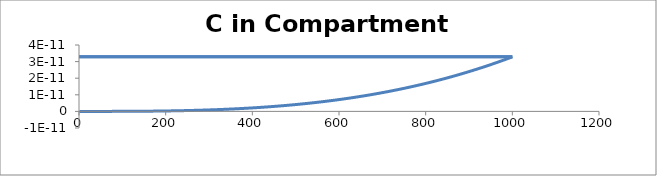
| Category | C - Sys 4 |
|---|---|
| 1.0 | 0 |
| 2.0 | 0 |
| 3.0 | 0 |
| 4.0 | 0 |
| 5.0 | 0 |
| 6.0 | 0 |
| 7.0 | 0 |
| 8.0 | 0 |
| 9.000000000000002 | 0 |
| 10.0 | 0 |
| 11.0 | 0 |
| 12.0 | 0 |
| 13.000000000000002 | 0 |
| 14.0 | 0 |
| 15.0 | 0 |
| 16.0 | 0 |
| 17.0 | 0 |
| 18.000000000000004 | 0 |
| 19.0 | 0 |
| 20.0 | 0 |
| 21.0 | 0 |
| 22.0 | 0 |
| 23.0 | 0 |
| 24.0 | 0 |
| 25.0 | 0 |
| 26.000000000000004 | 0 |
| 27.0 | 0 |
| 28.0 | 0 |
| 29.0 | 0 |
| 30.0 | 0 |
| 31.0 | 0 |
| 32.0 | 0 |
| 33.0 | 0 |
| 34.0 | 0 |
| 35.0 | 0 |
| 36.00000000000001 | 0 |
| 37.0 | 0 |
| 38.0 | 0 |
| 39.0 | 0 |
| 40.0 | 0 |
| 41.0 | 0 |
| 42.0 | 0 |
| 43.0 | 0 |
| 44.0 | 0 |
| 45.0 | 0 |
| 46.0 | 0 |
| 47.0 | 0 |
| 48.0 | 0 |
| 49.0 | 0 |
| 50.0 | 0 |
| 51.00000000000001 | 0 |
| 52.00000000000001 | 0 |
| 53.0 | 0 |
| 54.0 | 0 |
| 55.0 | 0 |
| 56.0 | 0 |
| 57.0 | 0 |
| 58.0 | 0 |
| 59.00000000000001 | 0 |
| 60.0 | 0 |
| 61.0 | 0 |
| 62.0 | 0 |
| 63.0 | 0 |
| 64.0 | 0 |
| 65.0 | 0 |
| 66.0 | 0 |
| 67.0 | 0 |
| 68.0 | 0 |
| 69.0 | 0 |
| 70.0 | 0 |
| 71.00000000000001 | 0 |
| 72.00000000000001 | 0 |
| 73.0 | 0 |
| 74.0 | 0 |
| 75.0 | 0 |
| 76.0 | 0 |
| 77.0 | 0 |
| 78.0 | 0 |
| 79.0 | 0 |
| 80.0 | 0 |
| 81.0 | 0 |
| 82.0 | 0 |
| 83.0 | 0 |
| 84.0 | 0 |
| 85.0 | 0 |
| 86.0 | 0 |
| 87.00000000000001 | 0 |
| 88.0 | 0 |
| 89.0 | 0 |
| 90.0 | 0 |
| 91.0 | 0 |
| 92.0 | 0 |
| 93.0 | 0 |
| 94.0 | 0 |
| 95.0 | 0 |
| 96.0 | 0 |
| 97.0 | 0 |
| 98.0 | 0 |
| 99.0 | 0 |
| 100.0 | 0 |
| 101.0 | 0 |
| 102.00000000000001 | 0 |
| 103.00000000000001 | 0 |
| 104.00000000000001 | 0 |
| 105.0 | 0 |
| 106.0 | 0 |
| 107.0 | 0 |
| 108.0 | 0 |
| 109.0 | 0 |
| 110.0 | 0 |
| 111.0 | 0 |
| 112.0 | 0 |
| 113.0 | 0 |
| 114.0 | 0 |
| 115.0 | 0 |
| 116.0 | 0 |
| 117.0 | 0 |
| 118.00000000000001 | 0 |
| 119.00000000000001 | 0 |
| 120.0 | 0 |
| 121.0 | 0 |
| 122.0 | 0 |
| 123.0 | 0 |
| 124.0 | 0 |
| 125.0 | 0 |
| 126.0 | 0 |
| 127.0 | 0 |
| 128.0 | 0 |
| 129.0 | 0 |
| 130.0 | 0 |
| 131.0 | 0 |
| 132.0 | 0 |
| 133.0 | 0 |
| 134.0 | 0 |
| 135.0 | 0 |
| 136.0 | 0 |
| 137.0 | 0 |
| 138.0 | 0 |
| 139.0 | 0 |
| 140.0 | 0 |
| 141.0 | 0 |
| 142.00000000000003 | 0 |
| 143.00000000000003 | 0 |
| 144.00000000000003 | 0 |
| 145.0 | 0 |
| 146.0 | 0 |
| 147.0 | 0 |
| 148.0 | 0 |
| 149.0 | 0 |
| 150.0 | 0 |
| 151.0 | 0 |
| 152.0 | 0 |
| 153.0 | 0 |
| 154.0 | 0 |
| 155.0 | 0 |
| 156.0 | 0 |
| 157.0 | 0 |
| 158.0 | 0 |
| 159.0 | 0 |
| 160.0 | 0 |
| 161.0 | 0 |
| 162.0 | 0 |
| 163.0 | 0 |
| 164.0 | 0 |
| 165.0 | 0 |
| 166.0 | 0 |
| 167.0 | 0 |
| 168.0 | 0 |
| 169.0 | 0 |
| 170.0 | 0 |
| 171.0 | 0 |
| 172.0 | 0 |
| 173.00000000000003 | 0 |
| 174.00000000000003 | 0 |
| 175.00000000000003 | 0 |
| 176.0 | 0 |
| 177.0 | 0 |
| 178.0 | 0 |
| 179.0 | 0 |
| 180.0 | 0 |
| 181.0 | 0 |
| 182.0 | 0 |
| 183.0 | 0 |
| 184.0 | 0 |
| 185.0 | 0 |
| 186.0 | 0 |
| 187.0 | 0 |
| 188.0 | 0 |
| 189.0 | 0 |
| 190.0 | 0 |
| 191.0 | 0 |
| 192.0 | 0 |
| 193.0 | 0 |
| 194.0 | 0 |
| 195.0 | 0 |
| 196.0 | 0 |
| 197.0 | 0 |
| 198.0 | 0 |
| 199.0 | 0 |
| 200.0 | 0 |
| 201.0 | 0 |
| 202.0 | 0 |
| 203.0 | 0 |
| 204.00000000000003 | 0 |
| 205.00000000000003 | 0 |
| 206.00000000000003 | 0 |
| 207.00000000000003 | 0 |
| 208.00000000000003 | 0 |
| 209.0 | 0 |
| 210.0 | 0 |
| 211.0 | 0 |
| 212.0 | 0 |
| 213.0 | 0 |
| 214.0 | 0 |
| 215.0 | 0 |
| 216.0 | 0 |
| 217.0 | 0 |
| 218.0 | 0 |
| 219.0 | 0 |
| 220.0 | 0 |
| 221.0 | 0 |
| 222.0 | 0 |
| 223.0 | 0 |
| 224.0 | 0 |
| 225.0 | 0 |
| 226.0 | 0 |
| 227.0 | 0 |
| 228.0 | 0 |
| 229.0 | 0 |
| 230.0 | 0 |
| 231.0 | 0 |
| 232.0 | 0 |
| 233.0 | 0 |
| 234.0 | 0 |
| 235.00000000000003 | 0 |
| 236.00000000000003 | 0 |
| 237.00000000000003 | 0 |
| 238.00000000000003 | 0 |
| 239.00000000000003 | 0 |
| 240.0 | 0 |
| 241.0 | 0 |
| 242.0 | 0 |
| 243.0 | 0 |
| 244.0 | 0 |
| 245.0 | 0 |
| 246.0 | 0 |
| 247.0 | 0 |
| 248.0 | 0 |
| 249.0 | 0 |
| 250.0 | 0 |
| 251.0 | 0 |
| 252.0 | 0 |
| 253.0 | 0 |
| 254.0 | 0 |
| 255.0 | 0 |
| 256.0 | 0 |
| 257.0 | 0 |
| 258.0 | 0 |
| 259.0 | 0 |
| 260.0 | 0 |
| 261.0 | 0 |
| 262.0 | 0 |
| 263.0 | 0 |
| 264.0 | 0 |
| 265.0 | 0 |
| 266.0 | 0 |
| 267.0 | 0 |
| 268.0 | 0 |
| 269.0 | 0 |
| 270.0 | 0 |
| 271.0 | 0 |
| 272.0 | 0 |
| 273.0 | 0 |
| 274.0 | 0 |
| 275.0 | 0 |
| 276.0 | 0 |
| 277.0 | 0 |
| 278.0 | 0 |
| 279.0 | 0 |
| 280.0 | 0 |
| 281.0 | 0 |
| 282.0 | 0 |
| 283.00000000000006 | 0 |
| 284.00000000000006 | 0 |
| 285.00000000000006 | 0 |
| 286.00000000000006 | 0 |
| 287.00000000000006 | 0 |
| 288.00000000000006 | 0 |
| 289.0 | 0 |
| 290.0 | 0 |
| 291.0 | 0 |
| 292.0 | 0 |
| 293.0 | 0 |
| 294.0 | 0 |
| 295.0 | 0 |
| 296.0 | 0 |
| 297.0 | 0 |
| 298.0 | 0 |
| 299.0 | 0 |
| 300.0 | 0 |
| 301.0 | 0 |
| 302.0 | 0 |
| 303.0 | 0 |
| 304.0 | 0 |
| 305.0 | 0 |
| 306.0 | 0 |
| 307.0 | 0 |
| 308.0 | 0 |
| 309.0 | 0 |
| 310.0 | 0 |
| 311.0 | 0 |
| 312.0 | 0 |
| 313.0 | 0 |
| 314.0 | 0 |
| 315.0 | 0 |
| 316.0 | 0 |
| 317.0 | 0 |
| 318.0 | 0 |
| 319.0 | 0 |
| 320.0 | 0 |
| 321.0 | 0 |
| 322.0 | 0 |
| 323.0 | 0 |
| 324.0 | 0 |
| 325.0 | 0 |
| 326.0 | 0 |
| 327.0 | 0 |
| 328.0 | 0 |
| 329.0 | 0 |
| 330.0 | 0 |
| 331.0 | 0 |
| 332.0 | 0 |
| 333.0 | 0 |
| 334.0 | 0 |
| 335.0 | 0 |
| 336.0 | 0 |
| 337.0 | 0 |
| 338.0 | 0 |
| 339.0 | 0 |
| 340.0 | 0 |
| 341.0 | 0 |
| 342.0 | 0 |
| 343.0 | 0 |
| 344.0 | 0 |
| 345.00000000000006 | 0 |
| 346.00000000000006 | 0 |
| 347.00000000000006 | 0 |
| 348.00000000000006 | 0 |
| 349.00000000000006 | 0 |
| 350.00000000000006 | 0 |
| 351.00000000000006 | 0 |
| 352.0 | 0 |
| 353.0 | 0 |
| 354.0 | 0 |
| 355.0 | 0 |
| 356.0 | 0 |
| 357.0 | 0 |
| 358.0 | 0 |
| 359.0 | 0 |
| 360.0 | 0 |
| 361.0 | 0 |
| 362.0 | 0 |
| 363.0 | 0 |
| 364.0 | 0 |
| 365.0 | 0 |
| 366.0 | 0 |
| 367.0 | 0 |
| 368.0 | 0 |
| 369.0 | 0 |
| 370.0 | 0 |
| 371.0 | 0 |
| 372.0 | 0 |
| 373.0 | 0 |
| 374.0 | 0 |
| 375.0 | 0 |
| 376.0 | 0 |
| 377.0 | 0 |
| 378.0 | 0 |
| 379.0 | 0 |
| 380.0 | 0 |
| 381.0 | 0 |
| 382.0 | 0 |
| 383.0 | 0 |
| 384.0 | 0 |
| 385.0 | 0 |
| 386.0 | 0 |
| 387.0 | 0 |
| 388.0 | 0 |
| 389.0 | 0 |
| 390.0 | 0 |
| 391.0 | 0 |
| 392.0 | 0 |
| 393.0 | 0 |
| 394.0 | 0 |
| 395.0 | 0 |
| 396.0 | 0 |
| 397.0 | 0 |
| 398.0 | 0 |
| 399.0 | 0 |
| 400.0 | 0 |
| 401.0 | 0 |
| 402.0 | 0 |
| 403.0 | 0 |
| 404.0 | 0 |
| 405.0 | 0 |
| 406.0 | 0 |
| 407.0 | 0 |
| 408.00000000000006 | 0 |
| 409.00000000000006 | 0 |
| 410.00000000000006 | 0 |
| 411.00000000000006 | 0 |
| 412.00000000000006 | 0 |
| 413.00000000000006 | 0 |
| 414.00000000000006 | 0 |
| 415.00000000000006 | 0 |
| 416.00000000000006 | 0 |
| 417.0 | 0 |
| 418.0 | 0 |
| 419.0 | 0 |
| 420.0 | 0 |
| 421.0 | 0 |
| 422.0 | 0 |
| 423.0 | 0 |
| 424.0 | 0 |
| 425.0 | 0 |
| 426.0 | 0 |
| 427.0 | 0 |
| 428.0 | 0 |
| 429.0 | 0 |
| 430.0 | 0 |
| 431.0 | 0 |
| 432.0 | 0 |
| 433.0 | 0 |
| 434.0 | 0 |
| 435.0 | 0 |
| 436.0 | 0 |
| 437.0 | 0 |
| 438.0 | 0 |
| 439.0 | 0 |
| 440.0 | 0 |
| 441.0 | 0 |
| 442.0 | 0 |
| 443.0 | 0 |
| 444.0 | 0 |
| 445.0 | 0 |
| 446.0 | 0 |
| 447.0 | 0 |
| 448.0 | 0 |
| 449.0 | 0 |
| 450.0 | 0 |
| 451.0 | 0 |
| 452.0 | 0 |
| 453.0 | 0 |
| 454.0 | 0 |
| 455.0 | 0 |
| 456.0 | 0 |
| 457.0 | 0 |
| 458.0 | 0 |
| 459.0 | 0 |
| 460.0 | 0 |
| 461.0 | 0 |
| 462.0 | 0 |
| 463.0 | 0 |
| 464.0 | 0 |
| 465.0 | 0 |
| 466.0 | 0 |
| 467.0 | 0 |
| 468.0 | 0 |
| 469.0 | 0 |
| 470.00000000000006 | 0 |
| 471.00000000000006 | 0 |
| 472.00000000000006 | 0 |
| 473.00000000000006 | 0 |
| 474.00000000000006 | 0 |
| 475.00000000000006 | 0 |
| 476.00000000000006 | 0 |
| 477.00000000000006 | 0 |
| 478.00000000000006 | 0 |
| 479.00000000000006 | 0 |
| 480.0 | 0 |
| 481.0 | 0 |
| 482.0 | 0 |
| 483.0 | 0 |
| 484.0 | 0 |
| 485.0 | 0 |
| 486.0 | 0 |
| 487.0 | 0 |
| 488.0 | 0 |
| 489.0 | 0 |
| 490.0 | 0 |
| 491.0 | 0 |
| 492.0 | 0 |
| 493.0 | 0 |
| 494.0 | 0 |
| 495.0 | 0 |
| 496.0 | 0 |
| 497.0 | 0 |
| 498.0 | 0 |
| 499.0 | 0 |
| 500.0 | 0 |
| 501.0 | 0 |
| 502.0 | 0 |
| 503.0 | 0 |
| 504.0 | 0 |
| 505.0 | 0 |
| 506.0 | 0 |
| 507.0 | 0 |
| 508.0 | 0 |
| 509.0 | 0 |
| 510.0 | 0 |
| 511.0 | 0 |
| 512.0 | 0 |
| 513.0 | 0 |
| 514.0 | 0 |
| 515.0 | 0 |
| 516.0 | 0 |
| 517.0 | 0 |
| 518.0 | 0 |
| 519.0 | 0 |
| 520.0 | 0 |
| 521.0 | 0 |
| 522.0 | 0 |
| 523.0 | 0 |
| 524.0 | 0 |
| 525.0 | 0 |
| 526.0 | 0 |
| 527.0 | 0 |
| 528.0 | 0 |
| 529.0 | 0 |
| 530.0 | 0 |
| 531.0 | 0 |
| 532.0 | 0 |
| 533.0 | 0 |
| 534.0 | 0 |
| 535.0 | 0 |
| 536.0 | 0 |
| 537.0 | 0 |
| 538.0 | 0 |
| 539.0 | 0 |
| 540.0 | 0 |
| 541.0 | 0 |
| 542.0 | 0 |
| 543.0 | 0 |
| 544.0 | 0 |
| 545.0 | 0 |
| 546.0 | 0 |
| 547.0 | 0 |
| 548.0 | 0 |
| 549.0 | 0 |
| 550.0 | 0 |
| 551.0 | 0 |
| 552.0 | 0 |
| 553.0 | 0 |
| 554.0 | 0 |
| 555.0 | 0 |
| 556.0 | 0 |
| 557.0 | 0 |
| 558.0 | 0 |
| 559.0 | 0 |
| 560.0 | 0 |
| 561.0 | 0 |
| 562.0 | 0 |
| 563.0 | 0 |
| 564.0 | 0 |
| 565.0000000000001 | 0 |
| 566.0000000000001 | 0 |
| 567.0000000000001 | 0 |
| 568.0000000000001 | 0 |
| 569.0000000000001 | 0 |
| 570.0000000000001 | 0 |
| 571.0000000000001 | 0 |
| 572.0000000000001 | 0 |
| 573.0000000000001 | 0 |
| 574.0000000000001 | 0 |
| 575.0000000000001 | 0 |
| 576.0000000000001 | 0 |
| 577.0 | 0 |
| 578.0 | 0 |
| 579.0 | 0 |
| 580.0 | 0 |
| 581.0 | 0 |
| 582.0 | 0 |
| 583.0 | 0 |
| 584.0 | 0 |
| 585.0 | 0 |
| 586.0 | 0 |
| 587.0 | 0 |
| 588.0 | 0 |
| 589.0 | 0 |
| 590.0 | 0 |
| 591.0 | 0 |
| 592.0 | 0 |
| 593.0 | 0 |
| 594.0 | 0 |
| 595.0 | 0 |
| 596.0 | 0 |
| 597.0 | 0 |
| 598.0 | 0 |
| 599.0 | 0 |
| 600.0 | 0 |
| 601.0 | 0 |
| 602.0 | 0 |
| 603.0 | 0 |
| 604.0 | 0 |
| 605.0 | 0 |
| 606.0 | 0 |
| 607.0 | 0 |
| 608.0 | 0 |
| 609.0 | 0 |
| 610.0 | 0 |
| 611.0 | 0 |
| 612.0 | 0 |
| 613.0 | 0 |
| 614.0 | 0 |
| 615.0 | 0 |
| 616.0 | 0 |
| 617.0 | 0 |
| 618.0 | 0 |
| 619.0 | 0 |
| 620.0 | 0 |
| 621.0 | 0 |
| 622.0 | 0 |
| 623.0 | 0 |
| 624.0 | 0 |
| 625.0 | 0 |
| 626.0 | 0 |
| 627.0 | 0 |
| 628.0 | 0 |
| 629.0 | 0 |
| 630.0 | 0 |
| 631.0 | 0 |
| 632.0 | 0 |
| 633.0 | 0 |
| 634.0 | 0 |
| 635.0 | 0 |
| 636.0 | 0 |
| 637.0 | 0 |
| 638.0 | 0 |
| 639.0 | 0 |
| 640.0 | 0 |
| 641.0 | 0 |
| 642.0 | 0 |
| 643.0 | 0 |
| 644.0 | 0 |
| 645.0 | 0 |
| 646.0 | 0 |
| 647.0 | 0 |
| 648.0 | 0 |
| 649.0 | 0 |
| 650.0 | 0 |
| 651.0 | 0 |
| 652.0 | 0 |
| 653.0 | 0 |
| 654.0 | 0 |
| 655.0 | 0 |
| 656.0 | 0 |
| 657.0 | 0 |
| 658.0 | 0 |
| 659.0 | 0 |
| 660.0 | 0 |
| 661.0 | 0 |
| 662.0 | 0 |
| 663.0 | 0 |
| 664.0 | 0 |
| 665.0 | 0 |
| 666.0 | 0 |
| 667.0 | 0 |
| 668.0 | 0 |
| 669.0 | 0 |
| 670.0 | 0 |
| 671.0 | 0 |
| 672.0 | 0 |
| 673.0 | 0 |
| 674.0 | 0 |
| 675.0 | 0 |
| 676.0 | 0 |
| 677.0 | 0 |
| 678.0 | 0 |
| 679.0 | 0 |
| 680.0 | 0 |
| 681.0 | 0 |
| 682.0 | 0 |
| 683.0 | 0 |
| 684.0 | 0 |
| 685.0 | 0 |
| 686.0 | 0 |
| 687.0 | 0 |
| 688.0 | 0 |
| 689.0 | 0 |
| 690.0000000000001 | 0 |
| 691.0000000000001 | 0 |
| 692.0000000000001 | 0 |
| 693.0000000000001 | 0 |
| 694.0000000000001 | 0 |
| 695.0000000000001 | 0 |
| 696.0000000000001 | 0 |
| 697.0000000000001 | 0 |
| 698.0000000000001 | 0 |
| 699.0000000000001 | 0 |
| 700.0000000000001 | 0 |
| 701.0000000000001 | 0 |
| 702.0000000000001 | 0 |
| 703.0000000000001 | 0 |
| 704.0 | 0 |
| 705.0 | 0 |
| 706.0 | 0 |
| 707.0 | 0 |
| 708.0 | 0 |
| 709.0 | 0 |
| 710.0 | 0 |
| 711.0 | 0 |
| 712.0 | 0 |
| 713.0 | 0 |
| 714.0 | 0 |
| 715.0 | 0 |
| 716.0 | 0 |
| 717.0 | 0 |
| 718.0 | 0 |
| 719.0 | 0 |
| 720.0 | 0 |
| 721.0 | 0 |
| 722.0 | 0 |
| 723.0 | 0 |
| 724.0 | 0 |
| 725.0 | 0 |
| 726.0 | 0 |
| 727.0 | 0 |
| 728.0 | 0 |
| 729.0 | 0 |
| 730.0 | 0 |
| 731.0 | 0 |
| 732.0 | 0 |
| 733.0 | 0 |
| 734.0 | 0 |
| 735.0 | 0 |
| 736.0 | 0 |
| 737.0 | 0 |
| 738.0 | 0 |
| 739.0 | 0 |
| 740.0 | 0 |
| 741.0 | 0 |
| 742.0 | 0 |
| 743.0 | 0 |
| 744.0 | 0 |
| 745.0 | 0 |
| 746.0 | 0 |
| 747.0 | 0 |
| 748.0 | 0 |
| 749.0 | 0 |
| 750.0 | 0 |
| 751.0 | 0 |
| 752.0 | 0 |
| 753.0 | 0 |
| 754.0 | 0 |
| 755.0 | 0 |
| 756.0 | 0 |
| 757.0 | 0 |
| 758.0 | 0 |
| 759.0 | 0 |
| 760.0 | 0 |
| 761.0 | 0 |
| 762.0 | 0 |
| 763.0 | 0 |
| 764.0 | 0 |
| 765.0 | 0 |
| 766.0 | 0 |
| 767.0 | 0 |
| 768.0 | 0 |
| 769.0 | 0 |
| 770.0 | 0 |
| 771.0 | 0 |
| 772.0 | 0 |
| 773.0 | 0 |
| 774.0 | 0 |
| 775.0 | 0 |
| 776.0 | 0 |
| 777.0 | 0 |
| 778.0 | 0 |
| 779.0 | 0 |
| 780.0 | 0 |
| 781.0 | 0 |
| 782.0 | 0 |
| 783.0 | 0 |
| 784.0 | 0 |
| 785.0 | 0 |
| 786.0 | 0 |
| 787.0 | 0 |
| 788.0 | 0 |
| 789.0 | 0 |
| 790.0 | 0 |
| 791.0 | 0 |
| 792.0 | 0 |
| 793.0 | 0 |
| 794.0 | 0 |
| 795.0 | 0 |
| 796.0 | 0 |
| 797.0 | 0 |
| 798.0 | 0 |
| 799.0 | 0 |
| 800.0 | 0 |
| 801.0 | 0 |
| 802.0 | 0 |
| 803.0 | 0 |
| 804.0 | 0 |
| 805.0 | 0 |
| 806.0 | 0 |
| 807.0 | 0 |
| 808.0 | 0 |
| 809.0 | 0 |
| 810.0 | 0 |
| 811.0 | 0 |
| 812.0 | 0 |
| 813.0 | 0 |
| 814.0 | 0 |
| 815.0000000000001 | 0 |
| 816.0000000000001 | 0 |
| 817.0000000000001 | 0 |
| 818.0000000000001 | 0 |
| 819.0000000000001 | 0 |
| 820.0000000000001 | 0 |
| 821.0000000000001 | 0 |
| 822.0000000000001 | 0 |
| 823.0000000000001 | 0 |
| 824.0000000000001 | 0 |
| 825.0000000000001 | 0 |
| 826.0000000000001 | 0 |
| 827.0000000000001 | 0 |
| 828.0000000000001 | 0 |
| 829.0000000000001 | 0 |
| 830.0000000000001 | 0 |
| 831.0000000000001 | 0 |
| 832.0000000000001 | 0 |
| 833.0 | 0 |
| 834.0 | 0 |
| 835.0 | 0 |
| 836.0 | 0 |
| 837.0 | 0 |
| 838.0 | 0 |
| 839.0 | 0 |
| 840.0 | 0 |
| 841.0 | 0 |
| 842.0 | 0 |
| 843.0 | 0 |
| 844.0 | 0 |
| 845.0 | 0 |
| 846.0 | 0 |
| 847.0 | 0 |
| 848.0 | 0 |
| 849.0 | 0 |
| 850.0 | 0 |
| 851.0 | 0 |
| 852.0 | 0 |
| 853.0 | 0 |
| 854.0 | 0 |
| 855.0 | 0 |
| 856.0 | 0 |
| 857.0 | 0 |
| 858.0 | 0 |
| 859.0 | 0 |
| 860.0 | 0 |
| 861.0 | 0 |
| 862.0 | 0 |
| 863.0 | 0 |
| 864.0 | 0 |
| 865.0 | 0 |
| 866.0 | 0 |
| 867.0 | 0 |
| 868.0 | 0 |
| 869.0 | 0 |
| 870.0 | 0 |
| 871.0 | 0 |
| 872.0 | 0 |
| 873.0 | 0 |
| 874.0 | 0 |
| 875.0 | 0 |
| 876.0 | 0 |
| 877.0 | 0 |
| 878.0 | 0 |
| 879.0 | 0 |
| 880.0 | 0 |
| 881.0 | 0 |
| 882.0 | 0 |
| 883.0 | 0 |
| 884.0 | 0 |
| 885.0 | 0 |
| 886.0 | 0 |
| 887.0 | 0 |
| 888.0 | 0 |
| 889.0 | 0 |
| 890.0 | 0 |
| 891.0 | 0 |
| 892.0 | 0 |
| 893.0 | 0 |
| 894.0 | 0 |
| 895.0 | 0 |
| 896.0 | 0 |
| 897.0 | 0 |
| 898.0 | 0 |
| 899.0 | 0 |
| 900.0 | 0 |
| 901.0 | 0 |
| 902.0 | 0 |
| 903.0 | 0 |
| 904.0 | 0 |
| 905.0 | 0 |
| 906.0 | 0 |
| 907.0 | 0 |
| 908.0 | 0 |
| 909.0 | 0 |
| 910.0 | 0 |
| 911.0 | 0 |
| 912.0 | 0 |
| 913.0 | 0 |
| 914.0 | 0 |
| 915.0 | 0 |
| 916.0 | 0 |
| 917.0 | 0 |
| 918.0 | 0 |
| 919.0 | 0 |
| 920.0 | 0 |
| 921.0 | 0 |
| 922.0 | 0 |
| 923.0 | 0 |
| 924.0 | 0 |
| 925.0 | 0 |
| 926.0 | 0 |
| 927.0 | 0 |
| 928.0 | 0 |
| 929.0 | 0 |
| 930.0 | 0 |
| 931.0 | 0 |
| 932.0 | 0 |
| 933.0 | 0 |
| 934.0 | 0 |
| 935.0 | 0 |
| 936.0 | 0 |
| 937.0 | 0 |
| 938.0 | 0 |
| 939.0 | 0 |
| 940.0000000000001 | 0 |
| 941.0000000000001 | 0 |
| 942.0000000000001 | 0 |
| 943.0000000000001 | 0 |
| 944.0000000000001 | 0 |
| 945.0000000000001 | 0 |
| 946.0000000000001 | 0 |
| 947.0000000000001 | 0 |
| 948.0000000000001 | 0 |
| 949.0000000000001 | 0 |
| 950.0000000000001 | 0 |
| 951.0000000000001 | 0 |
| 952.0000000000001 | 0 |
| 953.0000000000001 | 0 |
| 954.0000000000001 | 0 |
| 955.0000000000001 | 0 |
| 956.0000000000001 | 0 |
| 957.0000000000001 | 0 |
| 958.0000000000001 | 0 |
| 959.0000000000001 | 0 |
| 960.0 | 0 |
| 961.0 | 0 |
| 962.0 | 0 |
| 963.0 | 0 |
| 964.0 | 0 |
| 965.0 | 0 |
| 966.0 | 0 |
| 967.0 | 0 |
| 968.0 | 0 |
| 969.0 | 0 |
| 970.0 | 0 |
| 971.0 | 0 |
| 972.0 | 0 |
| 973.0 | 0 |
| 974.0 | 0 |
| 975.0 | 0 |
| 976.0 | 0 |
| 977.0 | 0 |
| 978.0 | 0 |
| 979.0 | 0 |
| 980.0 | 0 |
| 981.0 | 0 |
| 982.0 | 0 |
| 983.0 | 0 |
| 984.0 | 0 |
| 985.0 | 0 |
| 986.0 | 0 |
| 987.0 | 0 |
| 988.0 | 0 |
| 989.0 | 0 |
| 990.0 | 0 |
| 991.0 | 0 |
| 992.0 | 0 |
| 993.0 | 0 |
| 994.0 | 0 |
| 995.0 | 0 |
| 996.0 | 0 |
| 997.0 | 0 |
| 998.0 | 0 |
| 999.0 | 0 |
| 1000.0 | 0 |